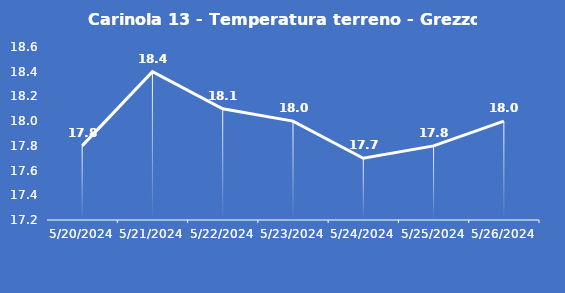
| Category | Carinola 13 - Temperatura terreno - Grezzo (°C) |
|---|---|
| 5/20/24 | 17.8 |
| 5/21/24 | 18.4 |
| 5/22/24 | 18.1 |
| 5/23/24 | 18 |
| 5/24/24 | 17.7 |
| 5/25/24 | 17.8 |
| 5/26/24 | 18 |